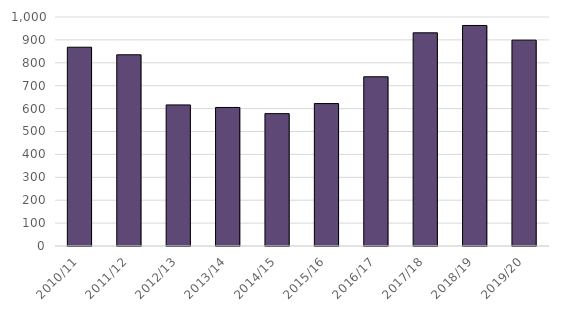
| Category | Series 0 |
|---|---|
| 2010/11 | 868 |
| 2011/12 | 835 |
| 2012/13 | 616 |
| 2013/14 | 605 |
| 2014/15 | 578 |
| 2015/16 | 622 |
| 2016/17 | 739 |
| 2017/18 | 931 |
| 2018/19 | 963 |
| 2019/20 | 899 |